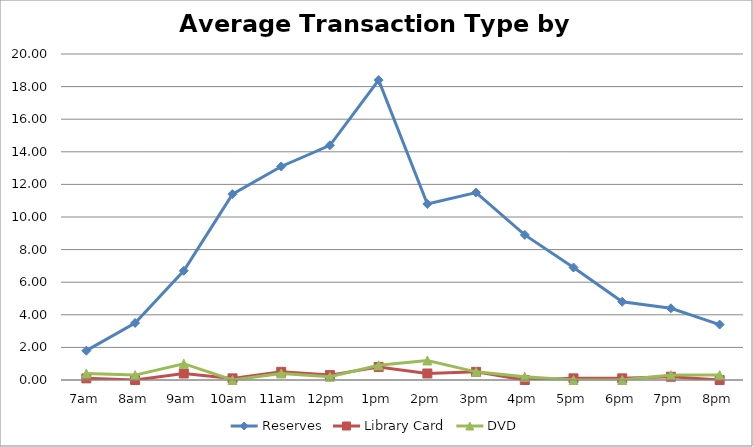
| Category | Reserves | Library Card | DVD |
|---|---|---|---|
| 7am | 1.8 | 0.1 | 0.4 |
| 8am | 3.5 | 0 | 0.3 |
| 9am | 6.7 | 0.4 | 1 |
| 10am | 11.4 | 0.1 | 0 |
| 11am | 13.1 | 0.5 | 0.4 |
| 12pm | 14.4 | 0.3 | 0.2 |
| 1pm | 18.4 | 0.8 | 0.9 |
| 2pm | 10.8 | 0.4 | 1.2 |
| 3pm | 11.5 | 0.5 | 0.5 |
| 4pm | 8.9 | 0 | 0.2 |
| 5pm | 6.9 | 0.1 | 0 |
| 6pm | 4.8 | 0.1 | 0 |
| 7pm | 4.4 | 0.2 | 0.3 |
| 8pm | 3.4 | 0 | 0.3 |